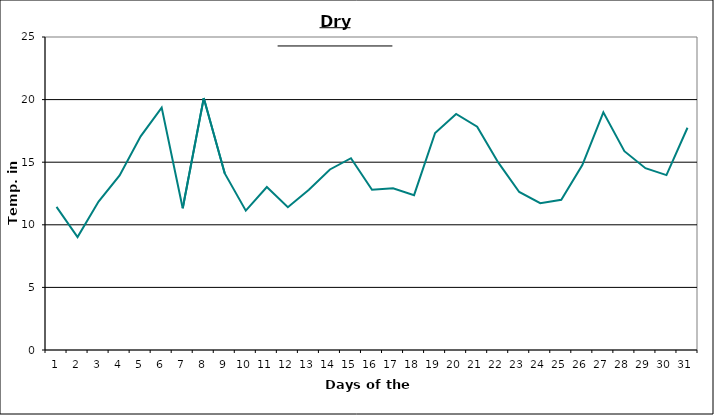
| Category | Series 0 |
|---|---|
| 0 | 11.43 |
| 1 | 9.02 |
| 2 | 11.86 |
| 3 | 13.94 |
| 4 | 17.07 |
| 5 | 19.36 |
| 6 | 11.32 |
| 7 | 20.12 |
| 8 | 14.1 |
| 9 | 11.13 |
| 10 | 13.02 |
| 11 | 11.41 |
| 12 | 12.8 |
| 13 | 14.42 |
| 14 | 15.32 |
| 15 | 12.8 |
| 16 | 12.92 |
| 17 | 12.37 |
| 18 | 17.33 |
| 19 | 18.85 |
| 20 | 17.84 |
| 21 | 14.98 |
| 22 | 12.62 |
| 23 | 11.73 |
| 24 | 12 |
| 25 | 14.77 |
| 26 | 18.98 |
| 27 | 15.88 |
| 28 | 14.52 |
| 29 | 13.97 |
| 30 | 17.75 |